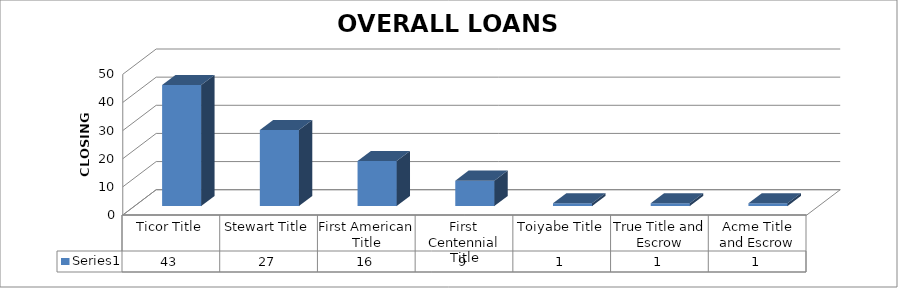
| Category | Series 0 |
|---|---|
| Ticor Title | 43 |
| Stewart Title | 27 |
| First American Title | 16 |
| First Centennial Title | 9 |
| Toiyabe Title | 1 |
| True Title and Escrow | 1 |
| Acme Title and Escrow | 1 |